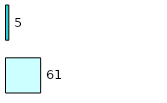
| Category | Series 0 | Series 1 |
|---|---|---|
| 0 | 61 | 5 |